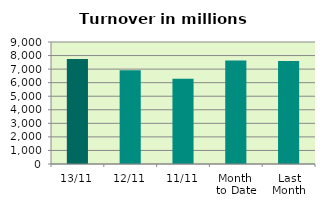
| Category | Series 0 |
|---|---|
| 13/11 | 7736.875 |
| 12/11 | 6912.393 |
| 11/11 | 6289.822 |
| Month 
to Date | 7626.966 |
| Last
Month | 7601.18 |